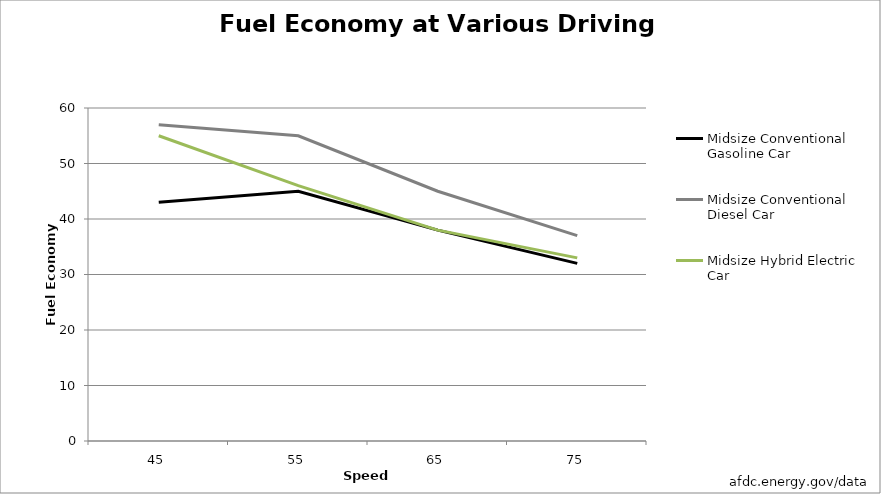
| Category | Midsize Conventional Gasoline Car | Midsize Conventional Diesel Car | Midsize Hybrid Electric Car |
|---|---|---|---|
| 45.0 | 43 | 57 | 55 |
| 55.0 | 45 | 55 | 46 |
| 65.0 | 38 | 45 | 38 |
| 75.0 | 32 | 37 | 33 |